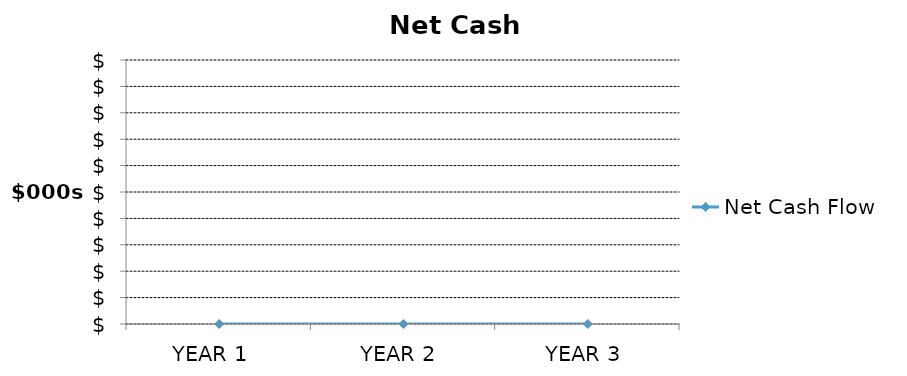
| Category | Net Cash Flow |
|---|---|
| YEAR 1  | 0 |
| YEAR 2 | 0 |
| YEAR 3 | 0 |